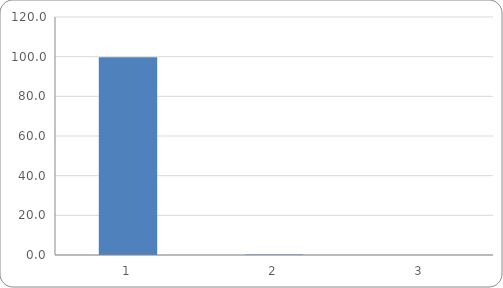
| Category | Component
Contribution
% |
|---|---|
| 0 | 99.75 |
| 1 | 0.248 |
| 2 | 0.002 |